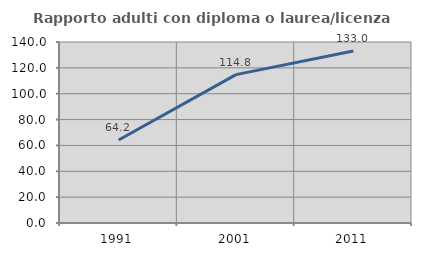
| Category | Rapporto adulti con diploma o laurea/licenza media  |
|---|---|
| 1991.0 | 64.219 |
| 2001.0 | 114.779 |
| 2011.0 | 132.982 |